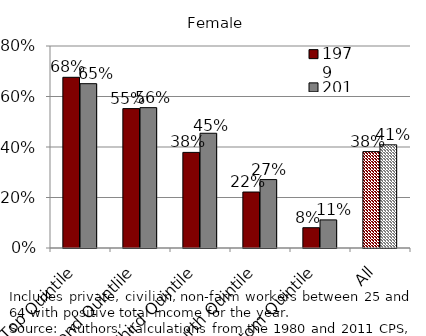
| Category | 1979 | 2010 |
|---|---|---|
| Top Quintile | 0.676 | 0.651 |
| Second Quintlile | 0.552 | 0.556 |
| Third Quintile | 0.379 | 0.454 |
| Fourth Quintile | 0.222 | 0.271 |
| Bottom Quintile | 0.08 | 0.111 |
| All | 0.382 | 0.409 |